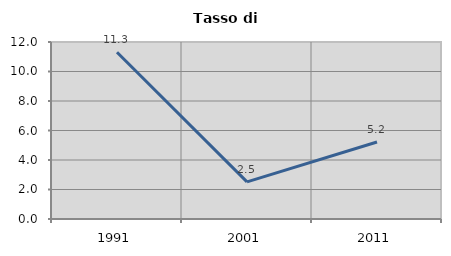
| Category | Tasso di disoccupazione   |
|---|---|
| 1991.0 | 11.307 |
| 2001.0 | 2.521 |
| 2011.0 | 5.221 |